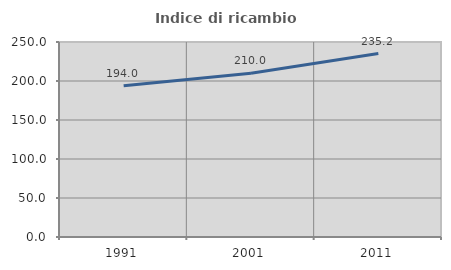
| Category | Indice di ricambio occupazionale  |
|---|---|
| 1991.0 | 194.048 |
| 2001.0 | 210 |
| 2011.0 | 235.246 |